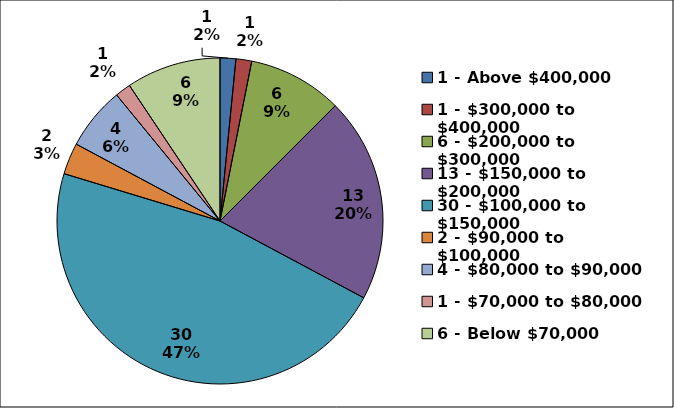
| Category | Series 0 |
|---|---|
| 1 - Above $400,000 | 1 |
| 1 - $300,000 to $400,000 | 1 |
| 6 - $200,000 to $300,000 | 6 |
| 13 - $150,000 to $200,000 | 13 |
| 30 - $100,000 to $150,000 | 30 |
| 2 - $90,000 to $100,000 | 2 |
| 4 - $80,000 to $90,000 | 4 |
| 1 - $70,000 to $80,000 | 1 |
| 6 - Below $70,000 | 6 |